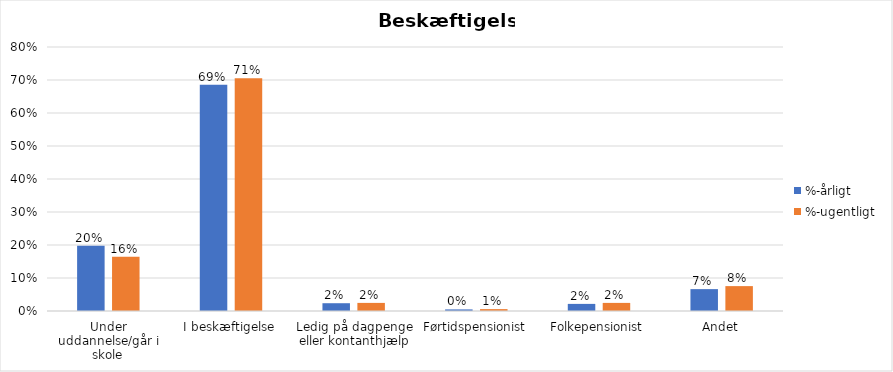
| Category | %-årligt | %-ugentligt |
|---|---|---|
| Under uddannelse/går i skole | 0.198 | 0.164 |
| I beskæftigelse | 0.686 | 0.705 |
| Ledig på dagpenge eller kontanthjælp | 0.024 | 0.025 |
| Førtidspensionist | 0.005 | 0.006 |
| Folkepensionist | 0.022 | 0.025 |
| Andet | 0.066 | 0.075 |